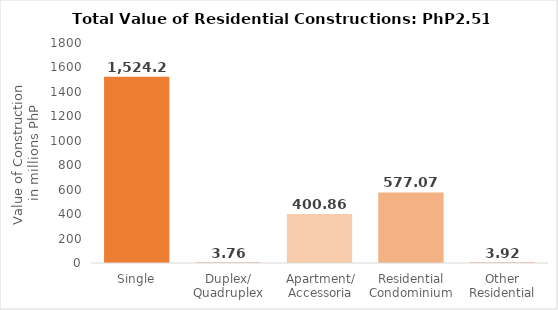
| Category | No |
|---|---|
| Single | 1524.236 |
| Duplex/ Quadruplex | 3.761 |
| Apartment/ Accessoria | 400.855 |
| Residential Condominium | 577.071 |
| Other Residential | 3.925 |